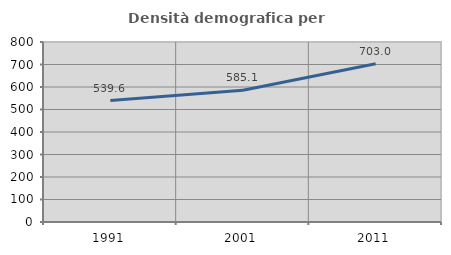
| Category | Densità demografica |
|---|---|
| 1991.0 | 539.65 |
| 2001.0 | 585.139 |
| 2011.0 | 703.014 |